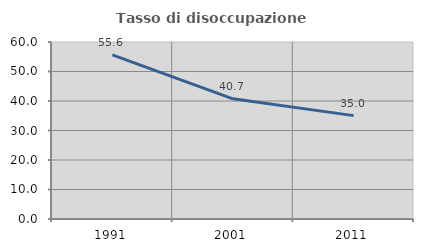
| Category | Tasso di disoccupazione giovanile  |
|---|---|
| 1991.0 | 55.611 |
| 2001.0 | 40.727 |
| 2011.0 | 35.043 |